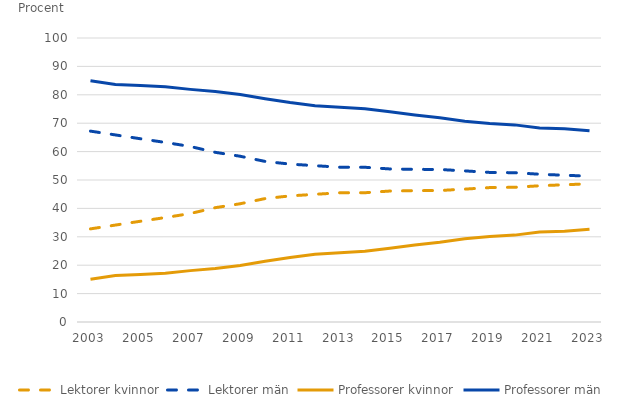
| Category | Lektorer kvinnor | Lektorer män | Professorer kvinnor | Professorer män |
|---|---|---|---|---|
| 2003 | 32.791 | 67.209 | 15.066 | 84.934 |
| 2004 | 34.133 | 65.867 | 16.373 | 83.627 |
| 2005 | 35.476 | 64.524 | 16.689 | 83.311 |
| 2006 | 36.776 | 63.224 | 17.183 | 82.817 |
| 2007 | 38.197 | 61.803 | 18.09 | 81.91 |
| 2008 | 40.25 | 59.75 | 18.869 | 81.131 |
| 2009 | 41.641 | 58.359 | 19.909 | 80.091 |
| 2010 | 43.46 | 56.54 | 21.358 | 78.642 |
| 2011 | 44.403 | 55.597 | 22.744 | 77.256 |
| 2012 | 44.962 | 55.038 | 23.893 | 76.107 |
| 2013 | 45.498 | 54.502 | 24.344 | 75.656 |
| 2014 | 45.518 | 54.482 | 24.889 | 75.111 |
| 2015 | 46.112 | 53.888 | 26.002 | 73.998 |
| 2016 | 46.238 | 53.762 | 27.143 | 72.857 |
| 2017 | 46.298 | 53.702 | 28.11 | 71.89 |
| 2018 | 46.789 | 53.211 | 29.295 | 70.705 |
| 2019 | 47.331 | 52.669 | 30.09 | 69.91 |
| 2020 | 47.431 | 52.569 | 30.593 | 69.407 |
| 2021 | 47.97 | 52.03 | 31.674 | 68.326 |
| 2022 | 48.329 | 51.671 | 31.927 | 68.073 |
| 2023 | 48.651 | 51.349 | 32.658 | 67.342 |